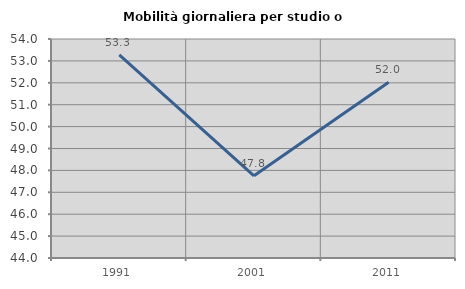
| Category | Mobilità giornaliera per studio o lavoro |
|---|---|
| 1991.0 | 53.279 |
| 2001.0 | 47.753 |
| 2011.0 | 52.023 |